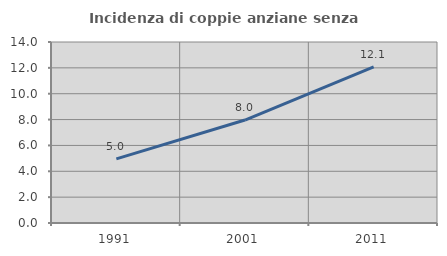
| Category | Incidenza di coppie anziane senza figli  |
|---|---|
| 1991.0 | 4.957 |
| 2001.0 | 7.965 |
| 2011.0 | 12.069 |